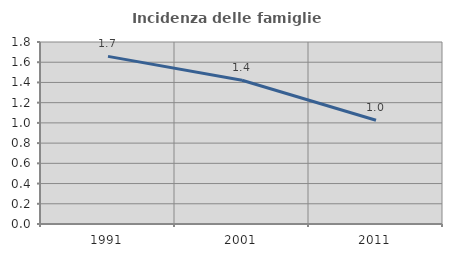
| Category | Incidenza delle famiglie numerose |
|---|---|
| 1991.0 | 1.658 |
| 2001.0 | 1.421 |
| 2011.0 | 1.027 |